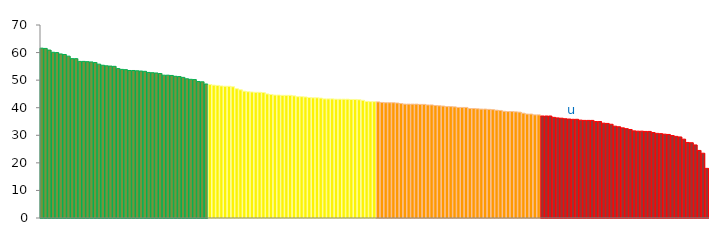
| Category | Top Quartile | 2nd Quartile | 3rd Quartile | Bottom Quartile | Series 4 |
|---|---|---|---|---|---|
|  | 61.6 | 0 | 0 | 0 | 61.6 |
|  | 61.5 | 0 | 0 | 0 | 61.5 |
|  | 60.9 | 0 | 0 | 0 | 60.9 |
|  | 60.1 | 0 | 0 | 0 | 60.1 |
|  | 60 | 0 | 0 | 0 | 60 |
|  | 59.5 | 0 | 0 | 0 | 59.5 |
|  | 59.3 | 0 | 0 | 0 | 59.3 |
|  | 58.7 | 0 | 0 | 0 | 58.7 |
|  | 57.8 | 0 | 0 | 0 | 57.8 |
|  | 57.8 | 0 | 0 | 0 | 57.8 |
|  | 56.8 | 0 | 0 | 0 | 56.8 |
|  | 56.8 | 0 | 0 | 0 | 56.8 |
|  | 56.7 | 0 | 0 | 0 | 56.7 |
|  | 56.6 | 0 | 0 | 0 | 56.6 |
|  | 56.4 | 0 | 0 | 0 | 56.4 |
|  | 55.8 | 0 | 0 | 0 | 55.8 |
|  | 55.4 | 0 | 0 | 0 | 55.4 |
|  | 55.2 | 0 | 0 | 0 | 55.2 |
|  | 55.1 | 0 | 0 | 0 | 55.1 |
|  | 55 | 0 | 0 | 0 | 55 |
|  | 54.2 | 0 | 0 | 0 | 54.2 |
|  | 53.9 | 0 | 0 | 0 | 53.9 |
|  | 53.8 | 0 | 0 | 0 | 53.8 |
|  | 53.5 | 0 | 0 | 0 | 53.5 |
|  | 53.5 | 0 | 0 | 0 | 53.5 |
|  | 53.4 | 0 | 0 | 0 | 53.4 |
|  | 53.3 | 0 | 0 | 0 | 53.3 |
|  | 53.2 | 0 | 0 | 0 | 53.2 |
|  | 52.8 | 0 | 0 | 0 | 52.8 |
|  | 52.7 | 0 | 0 | 0 | 52.7 |
|  | 52.6 | 0 | 0 | 0 | 52.6 |
|  | 52.4 | 0 | 0 | 0 | 52.4 |
|  | 51.8 | 0 | 0 | 0 | 51.8 |
|  | 51.8 | 0 | 0 | 0 | 51.8 |
|  | 51.7 | 0 | 0 | 0 | 51.7 |
|  | 51.4 | 0 | 0 | 0 | 51.4 |
|  | 51.3 | 0 | 0 | 0 | 51.3 |
|  | 51 | 0 | 0 | 0 | 51 |
|  | 50.5 | 0 | 0 | 0 | 50.5 |
|  | 50.3 | 0 | 0 | 0 | 50.3 |
|  | 50.2 | 0 | 0 | 0 | 50.2 |
|  | 49.5 | 0 | 0 | 0 | 49.5 |
|  | 49.4 | 0 | 0 | 0 | 49.4 |
|  | 48.6 | 0 | 0 | 0 | 48.6 |
|  | 0 | 48.4 | 0 | 0 | 48.4 |
|  | 0 | 48.2 | 0 | 0 | 48.2 |
|  | 0 | 48.1 | 0 | 0 | 48.1 |
|  | 0 | 47.9 | 0 | 0 | 47.9 |
|  | 0 | 47.8 | 0 | 0 | 47.8 |
|  | 0 | 47.8 | 0 | 0 | 47.8 |
|  | 0 | 47.6 | 0 | 0 | 47.6 |
|  | 0 | 46.9 | 0 | 0 | 46.9 |
|  | 0 | 46.5 | 0 | 0 | 46.5 |
|  | 0 | 46 | 0 | 0 | 46 |
|  | 0 | 45.8 | 0 | 0 | 45.8 |
|  | 0 | 45.7 | 0 | 0 | 45.7 |
|  | 0 | 45.6 | 0 | 0 | 45.6 |
|  | 0 | 45.6 | 0 | 0 | 45.6 |
|  | 0 | 45.5 | 0 | 0 | 45.5 |
|  | 0 | 45 | 0 | 0 | 45 |
|  | 0 | 44.8 | 0 | 0 | 44.8 |
|  | 0 | 44.6 | 0 | 0 | 44.6 |
|  | 0 | 44.6 | 0 | 0 | 44.6 |
|  | 0 | 44.5 | 0 | 0 | 44.5 |
|  | 0 | 44.5 | 0 | 0 | 44.5 |
|  | 0 | 44.5 | 0 | 0 | 44.5 |
|  | 0 | 44.3 | 0 | 0 | 44.3 |
|  | 0 | 44 | 0 | 0 | 44 |
|  | 0 | 44 | 0 | 0 | 44 |
|  | 0 | 43.9 | 0 | 0 | 43.9 |
|  | 0 | 43.7 | 0 | 0 | 43.7 |
|  | 0 | 43.6 | 0 | 0 | 43.6 |
|  | 0 | 43.6 | 0 | 0 | 43.6 |
|  | 0 | 43.5 | 0 | 0 | 43.5 |
|  | 0 | 43.2 | 0 | 0 | 43.2 |
|  | 0 | 43.2 | 0 | 0 | 43.2 |
|  | 0 | 43.2 | 0 | 0 | 43.2 |
|  | 0 | 43.1 | 0 | 0 | 43.1 |
|  | 0 | 43.1 | 0 | 0 | 43.1 |
|  | 0 | 43.1 | 0 | 0 | 43.1 |
|  | 0 | 43.1 | 0 | 0 | 43.1 |
|  | 0 | 43 | 0 | 0 | 43 |
|  | 0 | 43 | 0 | 0 | 43 |
|  | 0 | 42.9 | 0 | 0 | 42.9 |
|  | 0 | 42.7 | 0 | 0 | 42.7 |
|  | 0 | 42.3 | 0 | 0 | 42.3 |
|  | 0 | 42.2 | 0 | 0 | 42.2 |
|  | 0 | 42.2 | 0 | 0 | 42.2 |
|  | 0 | 0 | 42.1 | 0 | 42.1 |
|  | 0 | 0 | 41.9 | 0 | 41.9 |
|  | 0 | 0 | 41.8 | 0 | 41.8 |
|  | 0 | 0 | 41.8 | 0 | 41.8 |
|  | 0 | 0 | 41.8 | 0 | 41.8 |
|  | 0 | 0 | 41.7 | 0 | 41.7 |
|  | 0 | 0 | 41.5 | 0 | 41.5 |
|  | 0 | 0 | 41.3 | 0 | 41.3 |
|  | 0 | 0 | 41.3 | 0 | 41.3 |
|  | 0 | 0 | 41.3 | 0 | 41.3 |
|  | 0 | 0 | 41.3 | 0 | 41.3 |
|  | 0 | 0 | 41.2 | 0 | 41.2 |
|  | 0 | 0 | 41.2 | 0 | 41.2 |
|  | 0 | 0 | 41 | 0 | 41 |
|  | 0 | 0 | 41 | 0 | 41 |
|  | 0 | 0 | 40.8 | 0 | 40.8 |
|  | 0 | 0 | 40.7 | 0 | 40.7 |
|  | 0 | 0 | 40.6 | 0 | 40.6 |
|  | 0 | 0 | 40.4 | 0 | 40.4 |
|  | 0 | 0 | 40.4 | 0 | 40.4 |
|  | 0 | 0 | 40.3 | 0 | 40.3 |
|  | 0 | 0 | 40.1 | 0 | 40.1 |
|  | 0 | 0 | 40.1 | 0 | 40.1 |
|  | 0 | 0 | 40.1 | 0 | 40.1 |
|  | 0 | 0 | 39.7 | 0 | 39.7 |
|  | 0 | 0 | 39.7 | 0 | 39.7 |
|  | 0 | 0 | 39.6 | 0 | 39.6 |
|  | 0 | 0 | 39.5 | 0 | 39.5 |
|  | 0 | 0 | 39.5 | 0 | 39.5 |
|  | 0 | 0 | 39.4 | 0 | 39.4 |
|  | 0 | 0 | 39.3 | 0 | 39.3 |
|  | 0 | 0 | 39.1 | 0 | 39.1 |
|  | 0 | 0 | 39 | 0 | 39 |
|  | 0 | 0 | 38.7 | 0 | 38.7 |
|  | 0 | 0 | 38.6 | 0 | 38.6 |
|  | 0 | 0 | 38.6 | 0 | 38.6 |
|  | 0 | 0 | 38.5 | 0 | 38.5 |
|  | 0 | 0 | 38.4 | 0 | 38.4 |
|  | 0 | 0 | 38 | 0 | 38 |
|  | 0 | 0 | 37.7 | 0 | 37.7 |
|  | 0 | 0 | 37.7 | 0 | 37.7 |
|  | 0 | 0 | 37.4 | 0 | 37.4 |
|  | 0 | 0 | 37.4 | 0 | 37.4 |
|  | 0 | 0 | 0 | 37 | 37 |
|  | 0 | 0 | 0 | 37 | 37 |
|  | 0 | 0 | 0 | 37 | 37 |
|  | 0 | 0 | 0 | 36.5 | 36.5 |
|  | 0 | 0 | 0 | 36.3 | 36.3 |
|  | 0 | 0 | 0 | 36.2 | 36.2 |
|  | 0 | 0 | 0 | 36 | 36 |
|  | 0 | 0 | 0 | 35.9 | 35.9 |
| u | 0 | 0 | 0 | 35.8 | 35.8 |